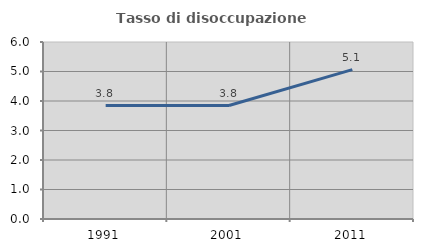
| Category | Tasso di disoccupazione giovanile  |
|---|---|
| 1991.0 | 3.846 |
| 2001.0 | 3.846 |
| 2011.0 | 5.063 |